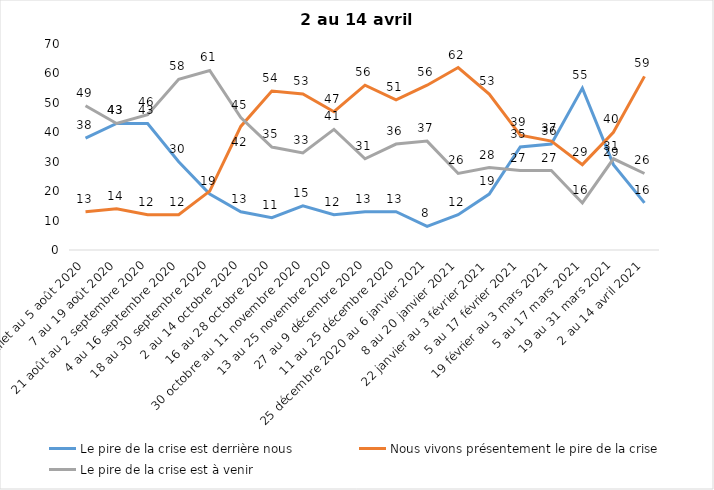
| Category | Le pire de la crise est derrière nous | Nous vivons présentement le pire de la crise | Le pire de la crise est à venir |
|---|---|---|---|
| 24 juillet au 5 août 2020 | 38 | 13 | 49 |
| 7 au 19 août 2020 | 43 | 14 | 43 |
| 21 août au 2 septembre 2020 | 43 | 12 | 46 |
| 4 au 16 septembre 2020 | 30 | 12 | 58 |
| 18 au 30 septembre 2020 | 19 | 20 | 61 |
| 2 au 14 octobre 2020 | 13 | 42 | 45 |
| 16 au 28 octobre 2020 | 11 | 54 | 35 |
| 30 octobre au 11 novembre 2020 | 15 | 53 | 33 |
| 13 au 25 novembre 2020 | 12 | 47 | 41 |
| 27 au 9 décembre 2020 | 13 | 56 | 31 |
| 11 au 25 décembre 2020 | 13 | 51 | 36 |
| 25 décembre 2020 au 6 janvier 2021 | 8 | 56 | 37 |
| 8 au 20 janvier 2021 | 12 | 62 | 26 |
| 22 janvier au 3 février 2021 | 19 | 53 | 28 |
| 5 au 17 février 2021 | 35 | 39 | 27 |
| 19 février au 3 mars 2021 | 36 | 37 | 27 |
| 5 au 17 mars 2021 | 55 | 29 | 16 |
| 19 au 31 mars 2021 | 29 | 40 | 31 |
| 2 au 14 avril 2021 | 16 | 59 | 26 |